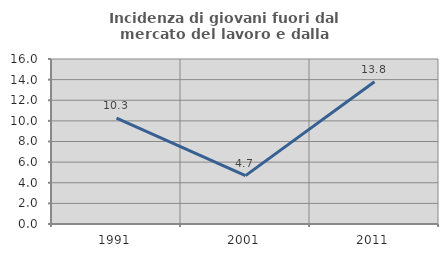
| Category | Incidenza di giovani fuori dal mercato del lavoro e dalla formazione  |
|---|---|
| 1991.0 | 10.256 |
| 2001.0 | 4.688 |
| 2011.0 | 13.793 |